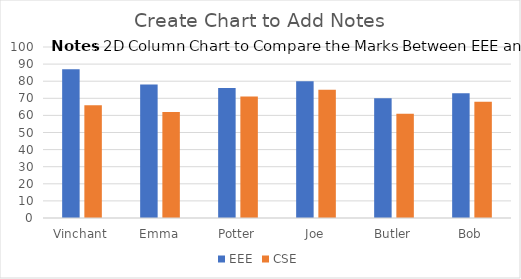
| Category | EEE | CSE |
|---|---|---|
| Vinchant | 87 | 66 |
| Emma | 78 | 62 |
| Potter | 76 | 71 |
| Joe | 80 | 75 |
| Butler | 70 | 61 |
| Bob | 73 | 68 |